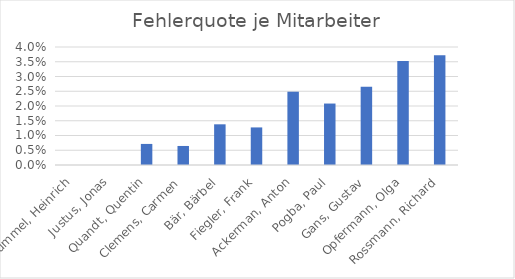
| Category | Series 0 |
|---|---|
| Hummel, Heinrich | 0 |
| Justus, Jonas | 0 |
| Quandt, Quentin | 0.007 |
| Clemens, Carmen | 0.006 |
| Bär, Bärbel | 0.014 |
| Fiegler, Frank | 0.013 |
| Ackerman, Anton | 0.025 |
| Pogba, Paul | 0.021 |
| Gans, Gustav | 0.026 |
| Opfermann, Olga | 0.035 |
| Rossmann, Richard | 0.037 |